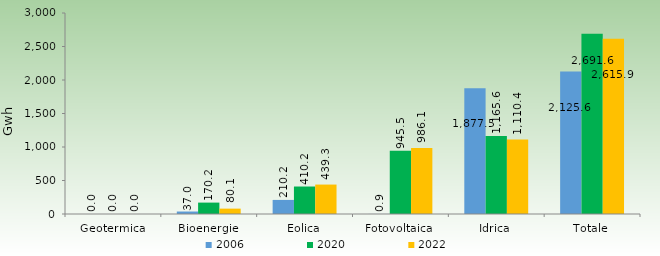
| Category | 2006 | 2020 | 2022 |
|---|---|---|---|
| Geotermica | 0 | 0 | 0 |
| Bioenergie | 37 | 170.2 | 80.1 |
| Eolica | 210.2 | 410.2 | 439.3 |
| Fotovoltaica | 0.9 | 945.5 | 986.1 |
| Idrica | 1877.5 | 1165.6 | 1110.4 |
| Totale | 2125.6 | 2691.6 | 2615.9 |